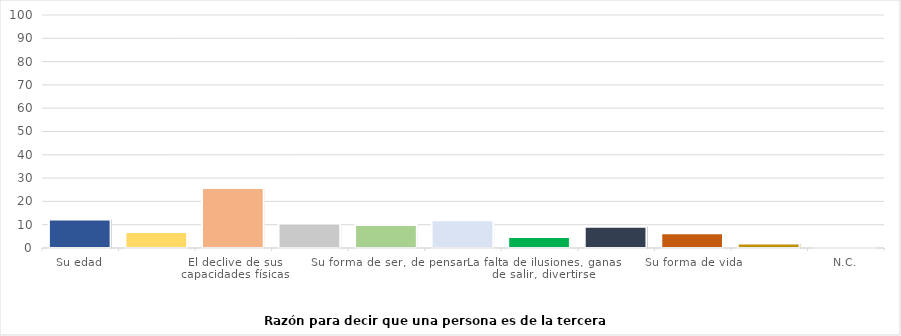
| Category | Series 0 |
|---|---|
| Su edad | 12.2 |
| Su aspecto físico | 6.9 |
| El declive de sus capacidades físicas | 25.8 |
| El declive de sus capacidades intelectuales | 10.5 |
| Su forma de ser, de pensar | 9.9 |
| Su salud | 11.9 |
| La falta de ilusiones, ganas de salir, divertirse | 4.7 |
| Estar jubilada | 9.1 |
| Su forma de vida | 6.3 |
| N.S. | 1.9 |
| N.C. | 0.8 |